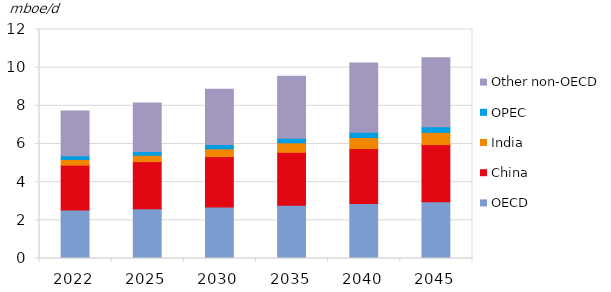
| Category | OECD | China | India | OPEC | Other non-OECD |
|---|---|---|---|---|---|
| 2022.0 | 2.536 | 2.356 | 0.3 | 0.188 | 2.354 |
| 2025.0 | 2.603 | 2.471 | 0.338 | 0.2 | 2.539 |
| 2030.0 | 2.702 | 2.635 | 0.411 | 0.221 | 2.893 |
| 2035.0 | 2.793 | 2.77 | 0.5 | 0.244 | 3.243 |
| 2040.0 | 2.879 | 2.882 | 0.58 | 0.269 | 3.633 |
| 2045.0 | 2.969 | 3 | 0.64 | 0.297 | 3.613 |